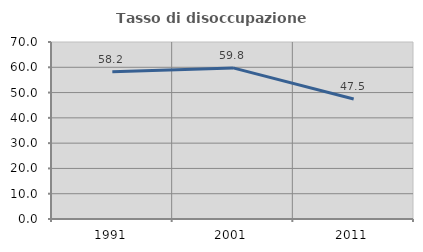
| Category | Tasso di disoccupazione giovanile  |
|---|---|
| 1991.0 | 58.219 |
| 2001.0 | 59.756 |
| 2011.0 | 47.458 |